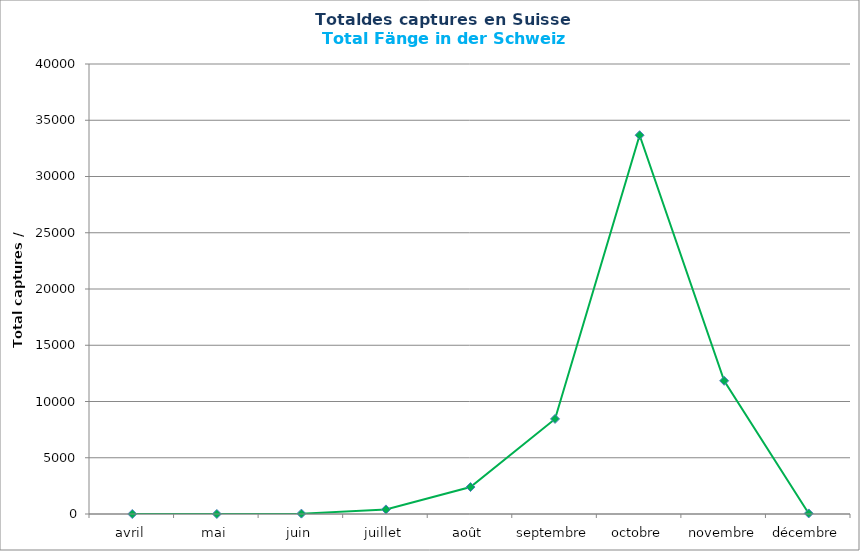
| Category | Series 0 |
|---|---|
| avril | 0 |
| mai | 3 |
| juin | 32 |
| juillet | 407 |
| août | 2396 |
| septembre | 8451 |
| octobre | 33673 |
| novembre | 11840 |
| décembre | 51 |